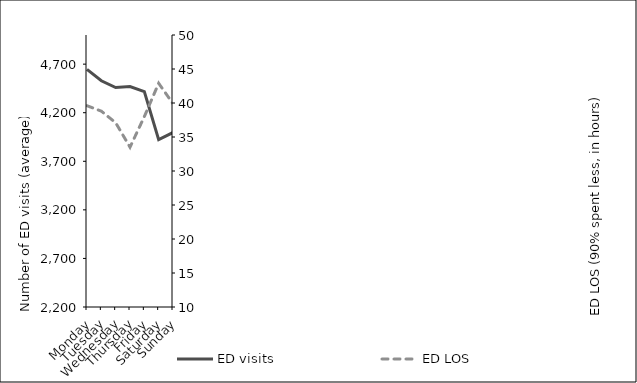
| Category | ED visits |
|---|---|
| Monday | 4646.698 |
| Tuesday | 4528.623 |
| Wednesday | 4459.038 |
| Thursday | 4469.077 |
| Friday | 4417.385 |
| Saturday | 3923.519 |
| Sunday | 3996.346 |